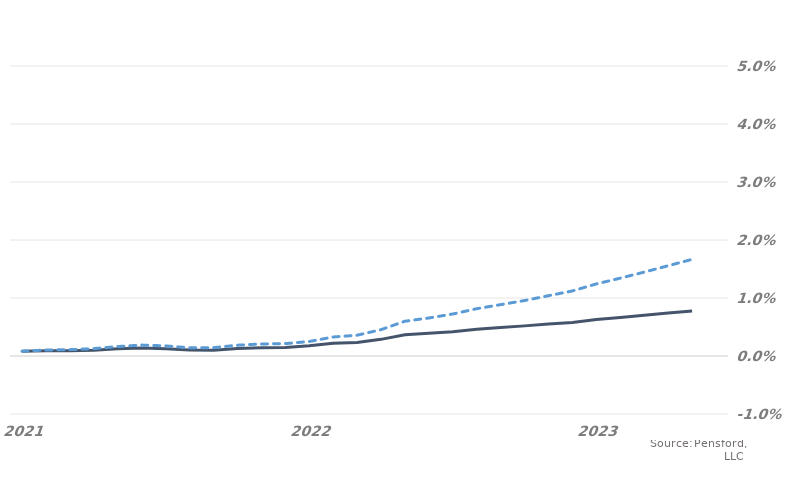
| Category | MARKET EXPECTATIONS | +1 Standard Deviation |
|---|---|---|
| 2021-08-31 | 0.001 | 0.001 |
| 2021-09-30 | 0.001 | 0.001 |
| 2021-10-30 | 0.001 | 0.001 |
| 2021-11-30 | 0.001 | 0.001 |
| 2021-12-30 | 0.001 | 0.002 |
| 2022-01-30 | 0.001 | 0.002 |
| 2022-02-28 | 0.001 | 0.002 |
| 2022-03-28 | 0.001 | 0.001 |
| 2022-04-28 | 0.001 | 0.001 |
| 2022-05-28 | 0.001 | 0.002 |
| 2022-06-28 | 0.001 | 0.002 |
| 2022-07-28 | 0.001 | 0.002 |
| 2022-08-28 | 0.002 | 0.002 |
| 2022-09-28 | 0.002 | 0.003 |
| 2022-10-28 | 0.002 | 0.004 |
| 2022-11-28 | 0.003 | 0.005 |
| 2022-12-28 | 0.004 | 0.006 |
| 2023-01-28 | 0.004 | 0.007 |
| 2023-02-28 | 0.004 | 0.007 |
| 2023-03-28 | 0.005 | 0.008 |
| 2023-04-28 | 0.005 | 0.009 |
| 2023-05-28 | 0.005 | 0.01 |
| 2023-06-28 | 0.005 | 0.01 |
| 2023-07-28 | 0.006 | 0.011 |
| 2023-08-28 | 0.006 | 0.012 |
| 2023-09-28 | 0.007 | 0.013 |
| 2023-10-28 | 0.007 | 0.014 |
| 2023-11-28 | 0.007 | 0.016 |
| 2023-12-28 | 0.008 | 0.017 |
| 2024-01-28 | 0.008 | 0.018 |
| 2024-02-28 | 0.009 | 0.019 |
| 2024-03-28 | 0.009 | 0.02 |
| 2024-04-28 | 0.009 | 0.021 |
| 2024-05-28 | 0.01 | 0.023 |
| 2024-06-28 | 0.01 | 0.023 |
| 2024-07-28 | 0.01 | 0.023 |
| 2024-08-28 | 0.01 | 0.022 |
| 2024-09-28 | 0.01 | 0.023 |
| 2024-10-28 | 0.01 | 0.024 |
| 2024-11-28 | 0.011 | 0.025 |
| 2024-12-28 | 0.011 | 0.026 |
| 2025-01-28 | 0.011 | 0.027 |
| 2025-02-28 | 0.012 | 0.028 |
| 2025-03-28 | 0.012 | 0.029 |
| 2025-04-28 | 0.012 | 0.03 |
| 2025-05-28 | 0.012 | 0.031 |
| 2025-06-28 | 0.013 | 0.031 |
| 2025-07-28 | 0.013 | 0.031 |
| 2025-08-28 | 0.012 | 0.029 |
| 2025-09-28 | 0.012 | 0.03 |
| 2025-10-28 | 0.012 | 0.031 |
| 2025-11-28 | 0.013 | 0.032 |
| 2025-12-28 | 0.013 | 0.033 |
| 2026-01-28 | 0.013 | 0.033 |
| 2026-02-28 | 0.013 | 0.034 |
| 2026-03-28 | 0.014 | 0.035 |
| 2026-04-28 | 0.014 | 0.036 |
| 2026-05-28 | 0.014 | 0.037 |
| 2026-06-28 | 0.014 | 0.036 |
| 2026-07-28 | 0.014 | 0.035 |
| 2026-08-28 | 0.014 | 0.033 |
| 2026-09-28 | 0.014 | 0.033 |
| 2026-10-28 | 0.014 | 0.034 |
| 2026-11-28 | 0.014 | 0.035 |
| 2026-12-28 | 0.015 | 0.036 |
| 2027-01-28 | 0.015 | 0.036 |
| 2027-02-28 | 0.015 | 0.037 |
| 2027-03-28 | 0.015 | 0.038 |
| 2027-04-28 | 0.015 | 0.039 |
| 2027-05-28 | 0.016 | 0.039 |
| 2027-06-28 | 0.016 | 0.041 |
| 2027-07-28 | 0.016 | 0.042 |
| 2027-08-28 | 0.015 | 0.041 |
| 2027-09-28 | 0.015 | 0.041 |
| 2027-10-28 | 0.015 | 0.042 |
| 2027-11-28 | 0.015 | 0.043 |
| 2027-12-28 | 0.016 | 0.044 |
| 2028-01-28 | 0.016 | 0.044 |
| 2028-02-28 | 0.016 | 0.045 |
| 2028-03-28 | 0.016 | 0.046 |
| 2028-04-28 | 0.016 | 0.047 |
| 2028-05-28 | 0.016 | 0.047 |
| 2028-06-28 | 0.016 | 0.046 |
| 2028-07-28 | 0.017 | 0.044 |
| 2028-08-28 | 0.016 | 0.041 |
| 2028-09-28 | 0.016 | 0.041 |
| 2028-10-28 | 0.016 | 0.042 |
| 2028-11-28 | 0.016 | 0.042 |
| 2028-12-28 | 0.016 | 0.043 |
| 2029-01-28 | 0.016 | 0.043 |
| 2029-02-28 | 0.017 | 0.044 |
| 2029-03-28 | 0.017 | 0.045 |
| 2029-04-28 | 0.017 | 0.045 |
| 2029-05-28 | 0.017 | 0.046 |
| 2029-06-28 | 0.017 | 0.047 |
| 2029-07-28 | 0.017 | 0.049 |
| 2029-08-28 | 0.016 | 0.048 |
| 2029-09-28 | 0.016 | 0.049 |
| 2029-10-28 | 0.017 | 0.05 |
| 2029-11-28 | 0.017 | 0.05 |
| 2029-12-28 | 0.017 | 0.051 |
| 2030-01-28 | 0.017 | 0.051 |
| 2030-02-28 | 0.017 | 0.052 |
| 2030-03-28 | 0.017 | 0.052 |
| 2030-04-28 | 0.017 | 0.053 |
| 2030-05-28 | 0.017 | 0.053 |
| 2030-06-28 | 0.017 | 0.052 |
| 2030-07-28 | 0.017 | 0.051 |
| 2030-08-28 | 0.017 | 0.048 |
| 2030-09-28 | 0.017 | 0.048 |
| 2030-10-28 | 0.017 | 0.049 |
| 2030-11-28 | 0.017 | 0.049 |
| 2030-12-28 | 0.017 | 0.05 |
| 2031-01-28 | 0.017 | 0.05 |
| 2031-02-28 | 0.017 | 0.051 |
| 2031-03-28 | 0.018 | 0.051 |
| 2031-04-28 | 0.018 | 0.052 |
| 2031-05-28 | 0.018 | 0.052 |
| 2031-06-28 | 0.018 | 0.052 |
| 2031-07-28 | 0.018 | 0.052 |